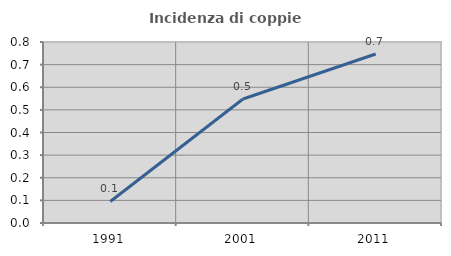
| Category | Incidenza di coppie miste |
|---|---|
| 1991.0 | 0.095 |
| 2001.0 | 0.548 |
| 2011.0 | 0.747 |